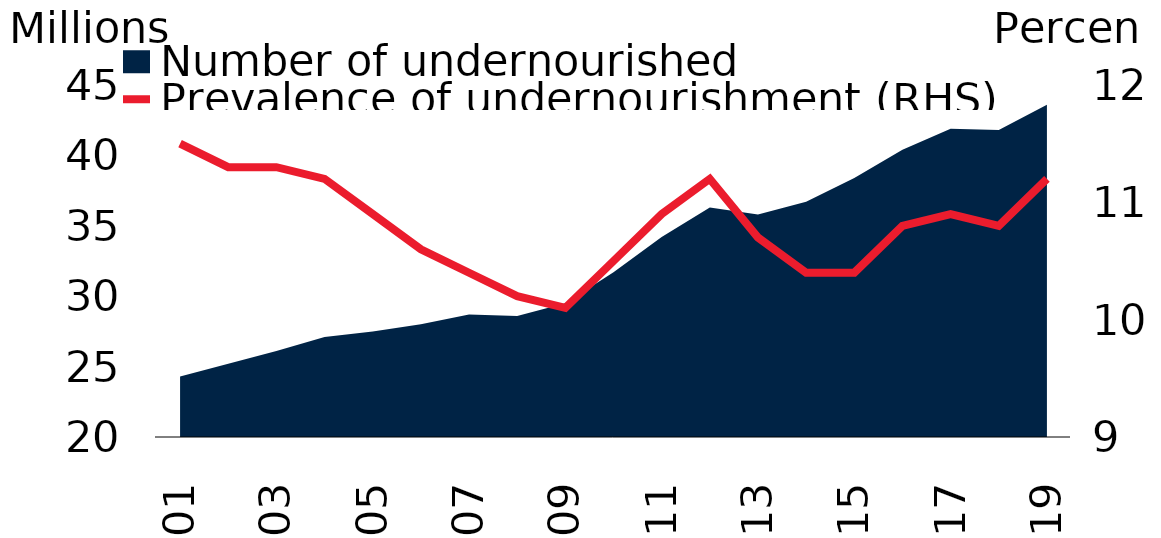
| Category | Prevalence of undernourishment (RHS) |
|---|---|
| 2001.0 | 11.5 |
| 2002.0 | 11.3 |
| 2003.0 | 11.3 |
| 2004.0 | 11.2 |
| 2005.0 | 10.9 |
| 2006.0 | 10.6 |
| 2007.0 | 10.4 |
| 2008.0 | 10.2 |
| 2009.0 | 10.1 |
| 2010.0 | 10.5 |
| 2011.0 | 10.9 |
| 2012.0 | 11.2 |
| 2013.0 | 10.7 |
| 2014.0 | 10.4 |
| 2015.0 | 10.4 |
| 2016.0 | 10.8 |
| 2017.0 | 10.9 |
| 2018.0 | 10.8 |
| 2019.0 | 11.2 |